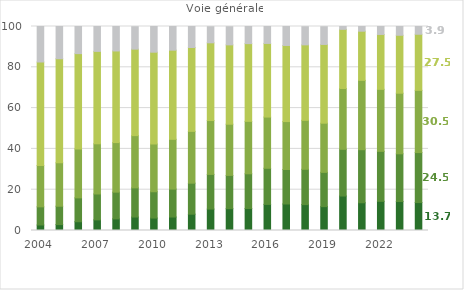
| Category | Très bien | Bien | Assez bien | Admis sans mention | Refusé |
|---|---|---|---|---|---|
| 2004 | 2.7 | 8.9 | 20.3 | 50.7 | 17.4 |
| 2005 | 2.9 | 9 | 21.3 | 51 | 15.8 |
| 2006 | 4.3 | 11.7 | 24 | 46.7 | 13.3 |
| 2007 | 5.2 | 12.7 | 24.6 | 45.3 | 12.2 |
| 2008 | 5.7 | 13.1 | 24.3 | 44.9 | 12 |
| 2009 | 6.6 | 14.3 | 25.6 | 42.4 | 11 |
| 2010 | 6.1 | 12.9 | 23.4 | 45 | 12.6 |
| 2011 | 6.6 | 13.7 | 24.4 | 43.7 | 11.6 |
| 2012 | 8 | 15.2 | 25.4 | 41.1 | 10.3 |
| 2013 | 10.5 | 17 | 26.4 | 38.1 | 7.9 |
| 2014 | 10.7 | 16.3 | 25.1 | 38.9 | 8.9 |
| 2015 | 10.8 | 17 | 25.7 | 38.1 | 8.4 |
| 2016 | 12.8 | 17.7 | 25.1 | 36.1 | 8.4 |
| 2017 | 13 | 16.9 | 23.5 | 37.3 | 9.3 |
| 2018 | 12.7 | 17.3 | 24 | 37 | 8.9 |
| 2019 | 11.7 | 16.8 | 24.1 | 38.6 | 8.7 |
| 2020 | 16.9 | 22.9 | 29.8 | 29 | 1.4 |
| 2021 | 13.6 | 26 | 34 | 24.1 | 2.4 |
| 2022 | 14.3 | 24.5 | 30.4 | 26.9 | 3.9 |
| 2023 | 14.2 | 23.4 | 29.7 | 28.4 | 4.3 |
| 2024p | 13.7 | 24.5 | 30.5 | 27.5 | 3.9 |